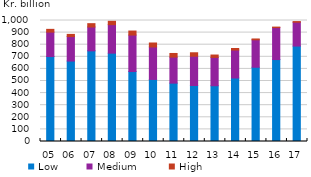
| Category | Low | Medium  | High |
|---|---|---|---|
| 05 | 702.218 | 201.899 | 22.671 |
| 06 | 664.758 | 202.314 | 18.156 |
| 07 | 749.075 | 197.246 | 27.552 |
| 08 | 730.076 | 235.584 | 27.795 |
| 09 | 578.229 | 301.442 | 33.229 |
| 10 | 512.987 | 268.188 | 32.919 |
| 11 | 482.313 | 215.272 | 29.989 |
| 12 | 462.976 | 241.817 | 28.516 |
| 13 | 460.859 | 234.134 | 19.665 |
| 14 | 524.889 | 230.669 | 13.155 |
| 15 | 613.708 | 226.534 | 7.132 |
| 16 | 677.221 | 264.137 | 4.153 |
| 17 | 788.814 | 196.932 | 5.26 |